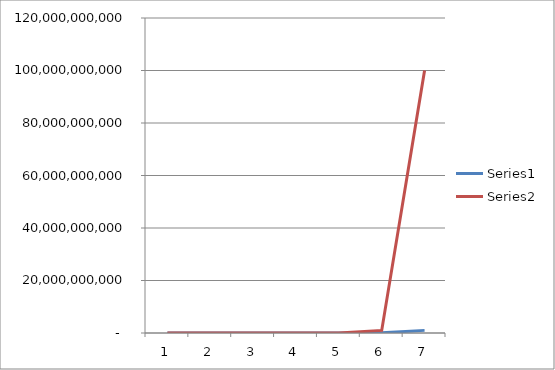
| Category | Series 0 | Series 1 |
|---|---|---|
| 0 | 1000 | 0.1 |
| 1 | 10000 | 10 |
| 2 | 100000 | 1000 |
| 3 | 1000000 | 100000 |
| 4 | 10000000 | 10000000 |
| 5 | 100000000 | 1000000000 |
| 6 | 1000000000 | 100000000000 |